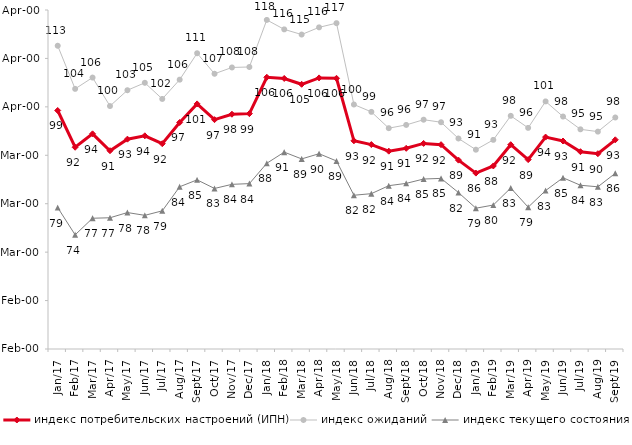
| Category | индекс потребительских настроений (ИПН) | Series 0 | индекс ожиданий | Series 3 | индекс текущего состояния |
|---|---|---|---|---|---|
| 2017-01-01 | 99.25 | 2017-01-01 | 112.617 | 2017-01-01 | 79.2 |
| 2017-02-01 | 91.66 | 2017-02-01 | 103.717 | 2017-02-01 | 73.575 |
| 2017-03-01 | 94.43 | 2017-03-01 | 106.05 | 2017-03-01 | 77 |
| 2017-04-01 | 90.94 | 2017-04-01 | 100.167 | 2017-04-01 | 77.1 |
| 2017-05-01 | 93.33 | 2017-05-01 | 103.433 | 2017-05-01 | 78.175 |
| 2017-06-01 | 94.02 | 2017-06-01 | 104.967 | 2017-06-01 | 77.6 |
| 2017-07-01 | 92.39 | 2017-07-01 | 101.633 | 2017-07-01 | 78.525 |
| 2017-08-01 | 96.77 | 2017-08-01 | 105.617 | 2017-08-01 | 83.5 |
| 2017-09-01 | 100.61 | 2017-09-01 | 111.067 | 2017-09-01 | 84.925 |
| 2017-10-01 | 97.36 | 2017-10-01 | 106.833 | 2017-10-01 | 83.15 |
| 2017-11-01 | 98.48 | 2017-11-01 | 108.133 | 2017-11-01 | 84 |
| 2017-12-01 | 98.6 | 2017-12-01 | 108.233 | 2017-12-01 | 84.15 |
| 2018-01-01 | 106.11 | 2018-01-01 | 117.95 | 2018-01-01 | 88.35 |
| 2018-02-01 | 105.86 | 2018-02-01 | 116 | 2018-02-01 | 90.65 |
| 2018-03-01 | 104.66 | 2018-03-01 | 114.933 | 2018-03-01 | 89.25 |
| 2018-04-01 | 105.98 | 2018-04-01 | 116.417 | 2018-04-01 | 90.325 |
| 2018-05-01 | 105.9 | 2018-05-01 | 117.283 | 2018-05-01 | 88.825 |
| 2018-06-01 | 92.99 | 2018-06-01 | 100.483 | 2018-06-01 | 81.75 |
| 2018-07-01 | 92.21 | 2018-07-01 | 98.967 | 2018-07-01 | 82.075 |
| 2018-08-01 | 90.85 | 2018-08-01 | 95.6 | 2018-08-01 | 83.725 |
| 2018-09-01 | 91.44 | 2018-09-01 | 96.267 | 2018-09-01 | 84.2 |
| 2018-10-01 | 92.45 | 2018-10-01 | 97.35 | 2018-10-01 | 85.1 |
| 2018-11-01 | 92.186 | 2018-11-01 | 96.823 | 2018-11-01 | 85.23 |
| 2018-12-01 | 89 | 2018-12-01 | 93.467 | 2018-12-01 | 82.3 |
| 2019-01-01 | 86.32 | 2019-01-01 | 91.15 | 2019-01-01 | 79.075 |
| 2019-02-01 | 87.8 | 2019-02-01 | 93.183 | 2019-02-01 | 79.725 |
| 2019-03-01 | 92.183 | 2019-03-01 | 98.144 | 2019-03-01 | 83.242 |
| 2019-04-01 | 89.109 | 2019-04-01 | 95.66 | 2019-04-01 | 79.282 |
| 2019-05-01 | 93.759 | 2019-05-01 | 101.123 | 2019-05-01 | 82.714 |
| 2019-06-01 | 92.948 | 2019-06-01 | 98.005 | 2019-06-01 | 85.362 |
| 2019-07-01 | 90.743 | 2019-07-01 | 95.363 | 2019-07-01 | 83.812 |
| 2019-08-01 | 90.33 | 2019-08-01 | 94.888 | 2019-08-01 | 83.492 |
| 2019-09-01 | 93.198 | 2019-09-01 | 97.805 | 2019-09-01 | 86.287 |